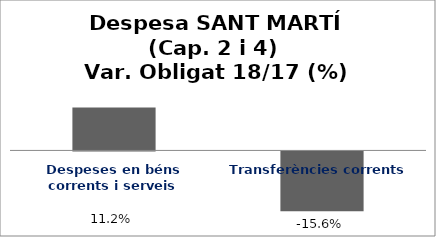
| Category | Series 0 |
|---|---|
| Despeses en béns corrents i serveis | 0.112 |
| Transferències corrents | -0.156 |